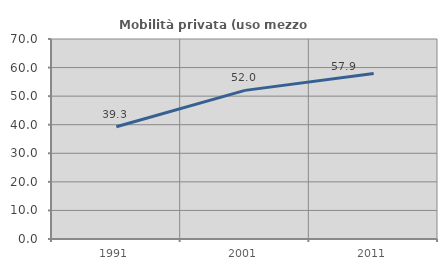
| Category | Mobilità privata (uso mezzo privato) |
|---|---|
| 1991.0 | 39.299 |
| 2001.0 | 52.016 |
| 2011.0 | 57.904 |